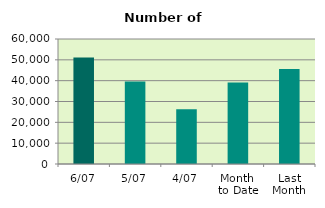
| Category | Series 0 |
|---|---|
| 6/07 | 51168 |
| 5/07 | 39590 |
| 4/07 | 26338 |
| Month 
to Date | 39060.5 |
| Last
Month | 45645.364 |